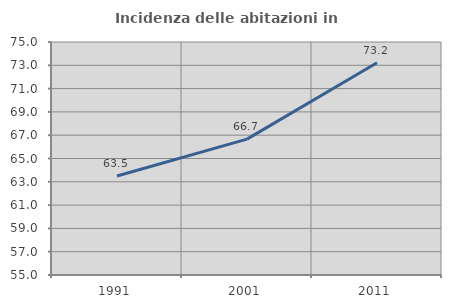
| Category | Incidenza delle abitazioni in proprietà  |
|---|---|
| 1991.0 | 63.497 |
| 2001.0 | 66.667 |
| 2011.0 | 73.214 |